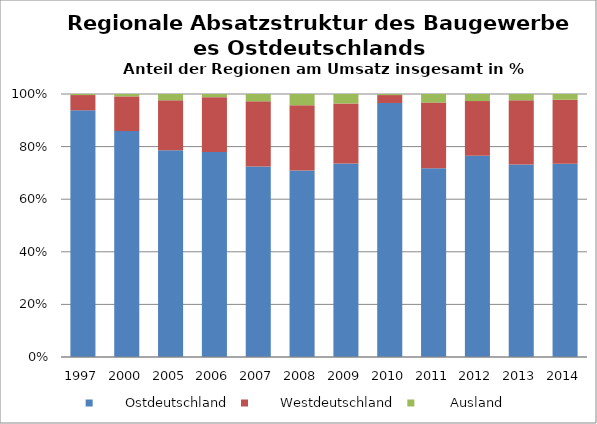
| Category |        Ostdeutschland |        Westdeutschland |         Ausland |
|---|---|---|---|
| 1997.0 | 93.8 | 5.8 | 0.4 |
| 2000.0 | 85.9 | 13.2 | 0.9 |
| 2005.0 | 78.6 | 19 | 2.4 |
| 2006.0 | 77.9 | 20.9 | 1.2 |
| 2007.0 | 72.4 | 24.8 | 2.8 |
| 2008.0 | 70.9 | 24.8 | 4.3 |
| 2009.0 | 73.6 | 22.8 | 3.6 |
| 2010.0 | 738 | 23.1 | 3.1 |
| 2011.0 | 72.5 | 25.2 | 3.3 |
| 2012.0 | 76.4 | 20.8 | 2.7 |
| 2013.0 | 73.2 | 24.4 | 2.4 |
| 2014.0 | 73.6 | 24.3 | 2.2 |